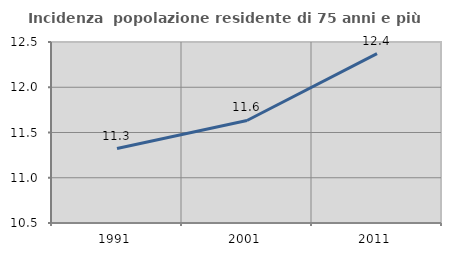
| Category | Incidenza  popolazione residente di 75 anni e più |
|---|---|
| 1991.0 | 11.323 |
| 2001.0 | 11.633 |
| 2011.0 | 12.371 |